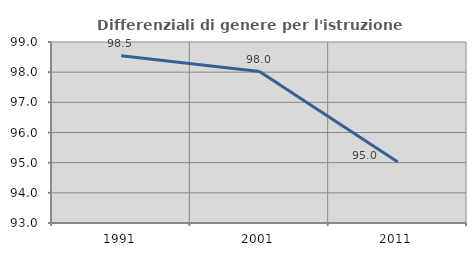
| Category | Differenziali di genere per l'istruzione superiore |
|---|---|
| 1991.0 | 98.542 |
| 2001.0 | 98.02 |
| 2011.0 | 95.02 |